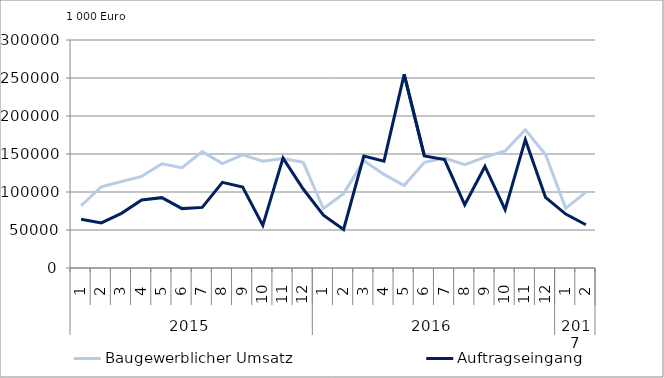
| Category | Baugewerblicher Umsatz | Auftragseingang |
|---|---|---|
| 0 | 81937.361 | 64244.383 |
| 1 | 106908.454 | 59377.677 |
| 2 | 113904.285 | 71953.971 |
| 3 | 120612.446 | 89496.024 |
| 4 | 137142.75 | 92563.213 |
| 5 | 132019.811 | 78131.737 |
| 6 | 153125.961 | 79765.729 |
| 7 | 137370.133 | 112637.987 |
| 8 | 148792.629 | 106572.56 |
| 9 | 140483.911 | 56073.767 |
| 10 | 144146.162 | 144643.688 |
| 11 | 139085.889 | 103931.175 |
| 12 | 78291.738 | 69470.357 |
| 13 | 97863.379 | 50640.033 |
| 14 | 141176.119 | 147206.65 |
| 15 | 123121.297 | 140579.009 |
| 16 | 108561.124 | 254739.334 |
| 17 | 139030.209 | 147481.644 |
| 18 | 144784.416 | 142609.658 |
| 19 | 135870.195 | 83192.156 |
| 20 | 145961.738 | 133594.351 |
| 21 | 153886.826 | 76793.838 |
| 22 | 181740.037 | 168867.568 |
| 23 | 149348.138 | 93011.853 |
| 24 | 78446.78 | 70908.903 |
| 25 | 99841.908 | 56868.408 |